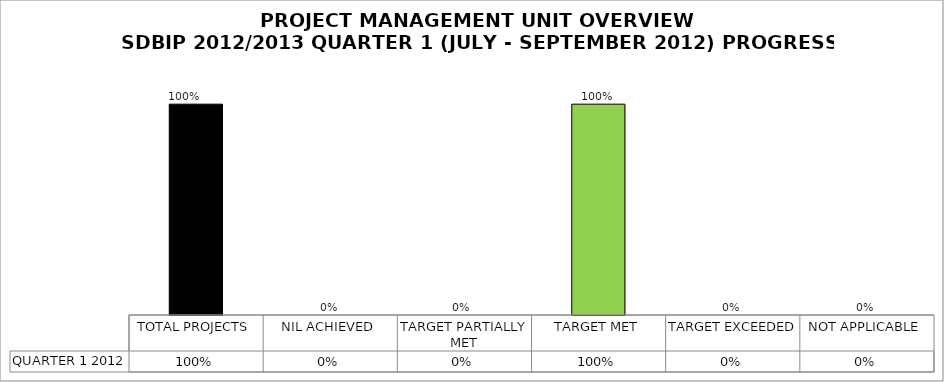
| Category | QUARTER 1 2012 |
|---|---|
| TOTAL PROJECTS | 1 |
| NIL ACHIEVED | 0 |
| TARGET PARTIALLY MET | 0 |
| TARGET MET | 1 |
| TARGET EXCEEDED | 0 |
| NOT APPLICABLE | 0 |